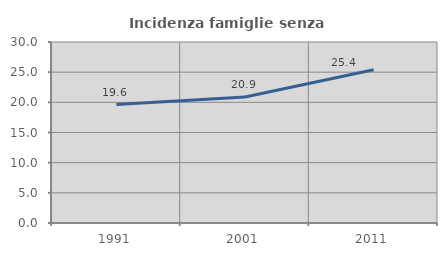
| Category | Incidenza famiglie senza nuclei |
|---|---|
| 1991.0 | 19.628 |
| 2001.0 | 20.885 |
| 2011.0 | 25.397 |